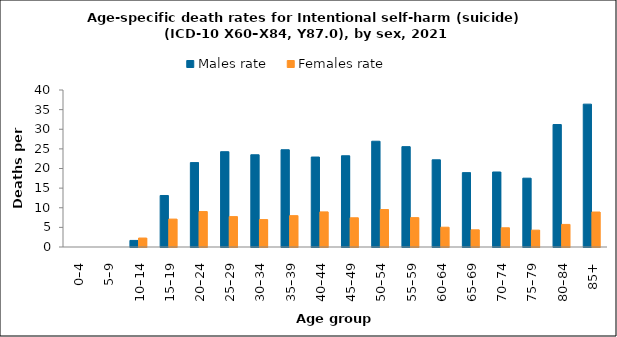
| Category | Males rate | Females rate |
|---|---|---|
| 0–4 | 0 | 0 |
| 5–9 | 0 | 0 |
| 10–14 | 1.676 | 2.283 |
| 15–19 | 13.123 | 7.107 |
| 20–24 | 21.503 | 9.03 |
| 25–29 | 24.281 | 7.747 |
| 30–34 | 23.497 | 6.986 |
| 35–39 | 24.778 | 7.986 |
| 40–44 | 22.92 | 8.943 |
| 45–49 | 23.247 | 7.445 |
| 50–54 | 26.947 | 9.542 |
| 55–59 | 25.572 | 7.488 |
| 60–64 | 22.216 | 5.041 |
| 65–69 | 18.946 | 4.377 |
| 70–74 | 19.11 | 4.898 |
| 75–79 | 17.533 | 4.292 |
| 80–84 | 31.205 | 5.754 |
| 85+ | 36.396 | 8.911 |